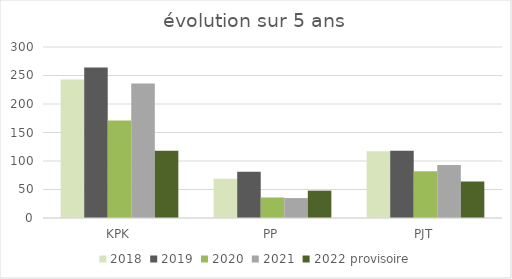
| Category | 2018 | 2019 | 2020 | 2021 | 2022 provisoire |
|---|---|---|---|---|---|
| KPK | 243 | 264 | 171 | 236 | 118 |
| PP | 69 | 81 | 36 | 35 | 48 |
| PJT | 117 | 118 | 82 | 93 | 64 |